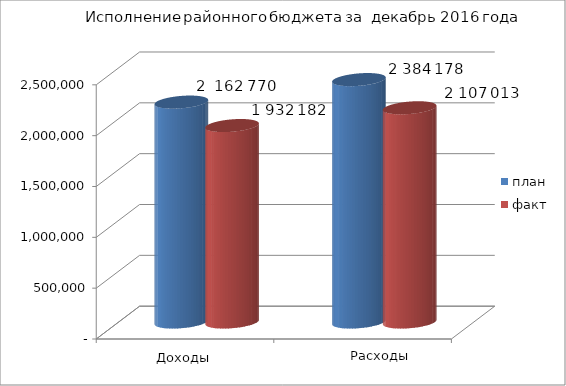
| Category | план | факт |
|---|---|---|
| 0 | 2162770 | 1932182 |
| 1 | 2384178 | 2107013 |